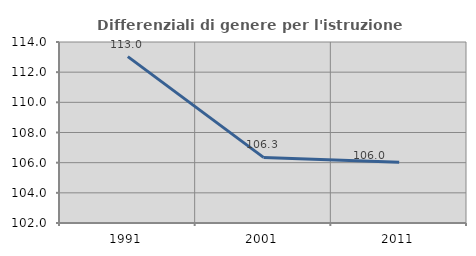
| Category | Differenziali di genere per l'istruzione superiore |
|---|---|
| 1991.0 | 113.031 |
| 2001.0 | 106.348 |
| 2011.0 | 106.029 |